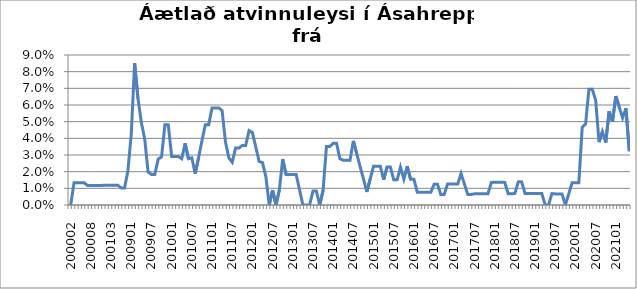
| Category | Series 0 |
|---|---|
| 200002 | 0 |
| 200003 | 0.013 |
| 200004 | 0.013 |
| 200005 | 0.013 |
| 200006 | 0.013 |
| 200007 | 0.012 |
| 200008 | 0.012 |
| 200010 | 0.012 |
| 200011 | 0.012 |
| 200012 | 0.012 |
| 200101 | 0.012 |
| 200102 | 0.012 |
| 200103 | 0.012 |
| 200104 | 0.012 |
| 200105 | 0.012 |
| 200810 | 0.01 |
| 200811 | 0.01 |
| 200812 | 0.02 |
| 200901 | 0.043 |
| 200902 | 0.085 |
| 200903 | 0.064 |
| 200904 | 0.05 |
| 200905 | 0.04 |
| 200906 | 0.02 |
| 200907 | 0.018 |
| 200908 | 0.018 |
| 200909 | 0.028 |
| 200910 | 0.029 |
| 200911 | 0.048 |
| 200912 | 0.048 |
| 201001 | 0.029 |
| 201002 | 0.029 |
| 201003 | 0.029 |
| 201004 | 0.028 |
| 201005 | 0.037 |
| 201006 | 0.028 |
| 201007 | 0.028 |
| 201008 | 0.019 |
| 201009 | 0.028 |
| 201010 | 0.038 |
| 201011 | 0.048 |
| 201012 | 0.048 |
| 201101 | 0.058 |
| 201102 | 0.058 |
| 201103 | 0.058 |
| 201104 | 0.057 |
| 201105 | 0.038 |
| 201106 | 0.028 |
| 201107 | 0.026 |
| 201108 | 0.034 |
| 201109 | 0.034 |
| 201110 | 0.036 |
| 201111 | 0.036 |
| 201112 | 0.045 |
| 201201 | 0.043 |
| 201202 | 0.035 |
| 201203 | 0.026 |
| 201204 | 0.025 |
| 201205 | 0.017 |
| 201206 | 0 |
| 201207 | 0.009 |
| 201208 | 0 |
| 201209 | 0.009 |
| 201210 | 0.028 |
| 201211 | 0.018 |
| 201212 | 0.018 |
| 201301 | 0.018 |
| 201302 | 0.018 |
| 201303 | 0.009 |
| 201304 | 0 |
| 201305 | 0 |
| 201306 | 0 |
| 201307 | 0.008 |
| 201308 | 0.008 |
| 201309 | 0 |
| 201310 | 0.009 |
| 201311 | 0.035 |
| 201312 | 0.035 |
| 201401 | 0.037 |
| 201402 | 0.037 |
| 201403 | 0.028 |
| 201404 | 0.027 |
| 201405 | 0.027 |
| 201406 | 0.027 |
| 201407 | 0.038 |
| 201408 | 0.031 |
| 201409 | 0.023 |
| 201410 | 0.016 |
| 201411 | 0.008 |
| 201412 | 0.016 |
| 201501 | 0.023 |
| 201502 | 0.023 |
| 201503 | 0.023 |
| 201504 | 0.015 |
| 201505 | 0.023 |
| 201506 | 0.023 |
| 201507 | 0.015 |
| 201508 | 0.015 |
| 201509 | 0.023 |
| 201510 | 0.016 |
| 201511 | 0.023 |
| 201512 | 0.016 |
| 201601 | 0.015 |
| 201602 | 0.008 |
| 201603 | 0.008 |
| 201604 | 0.008 |
| 201605 | 0.008 |
| 201606 | 0.008 |
| 201607 | 0.012 |
| 201608 | 0.012 |
| 201609 | 0.006 |
| 201610 | 0.006 |
| 201611 | 0.013 |
| 201612 | 0.013 |
| 201701 | 0.013 |
| 201702 | 0.013 |
| 201703 | 0.019 |
| 201704 | 0.013 |
| 201705 | 0.006 |
| 201706 | 0.006 |
| 201707 | 0.007 |
| 201708 | 0.007 |
| 201709 | 0.007 |
| 201710 | 0.007 |
| 201711 | 0.007 |
| 201712 | 0.014 |
| 201801 | 0.014 |
| 201802 | 0.014 |
| 201803 | 0.014 |
| 201804 | 0.014 |
| 201805 | 0.007 |
| 201806 | 0.007 |
| 201807 | 0.007 |
| 201808 | 0.014 |
| 201809 | 0.014 |
| 201810 | 0.007 |
| 201811 | 0.007 |
| 201812 | 0.007 |
| 201901 | 0.007 |
| 201902 | 0.007 |
| 201903 | 0.007 |
| 201904 | 0 |
| 201905 | 0 |
| 201906 | 0.007 |
| 201907 | 0.007 |
| 201908 | 0.007 |
| 201909 | 0.007 |
| 201910 | 0 |
| 201911 | 0.007 |
| 201912 | 0.013 |
| 202001 | 0.013 |
| 202002 | 0.013 |
| 202003 | 0.047 |
| 202004 | 0.049 |
| 202005 | 0.069 |
| 202006 | 0.069 |
| 202007 | 0.063 |
| 202008 | 0.038 |
| 202009 | 0.044 |
| 202010 | 0.038 |
| 202011 | 0.056 |
| 202012 | 0.05 |
| 202101 | 0.065 |
| 202102 | 0.059 |
| 202103 | 0.052 |
| 202104 | 0.058 |
| 202105 | 0.032 |